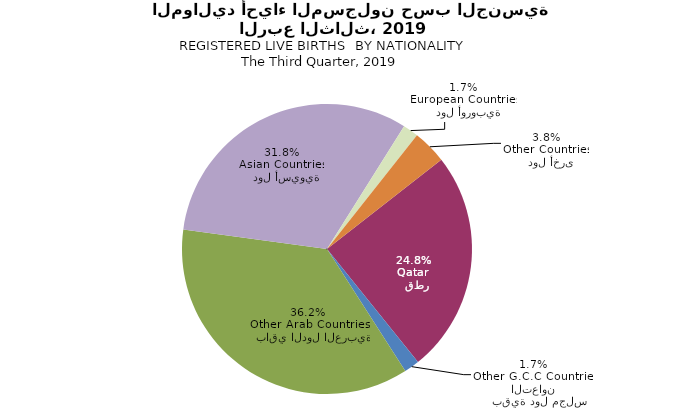
| Category | Series 0 |
|---|---|
|   قطر
Qatar | 1646 |
|   بقية دول مجلس التعاون
Other G.C.C Countries | 114 |
|   باقي الدول العربية
Other Arab Countries | 2408 |
|   دول أسيوية
Asian Countries | 2112 |
|   دول أوروبية
European Countries | 115 |
|   دول أخرى
Other Countries | 252 |